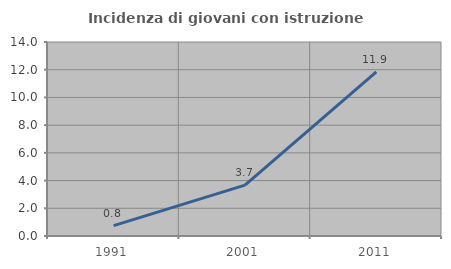
| Category | Incidenza di giovani con istruzione universitaria |
|---|---|
| 1991.0 | 0.753 |
| 2001.0 | 3.67 |
| 2011.0 | 11.852 |